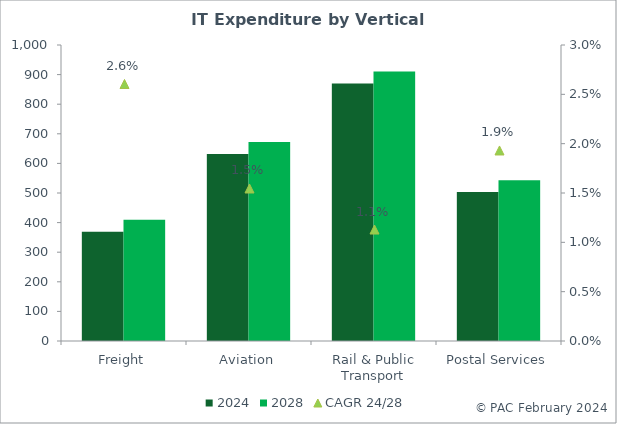
| Category | 2024 | 2028 |
|---|---|---|
| Freight | 369.225 | 409.225 |
| Aviation | 632.094 | 672.094 |
| Rail & Public Transport | 870.215 | 910.215 |
| Postal Services | 503.092 | 543.092 |